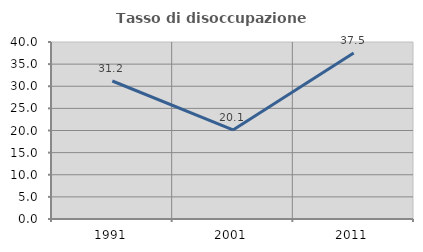
| Category | Tasso di disoccupazione giovanile  |
|---|---|
| 1991.0 | 31.186 |
| 2001.0 | 20.122 |
| 2011.0 | 37.5 |